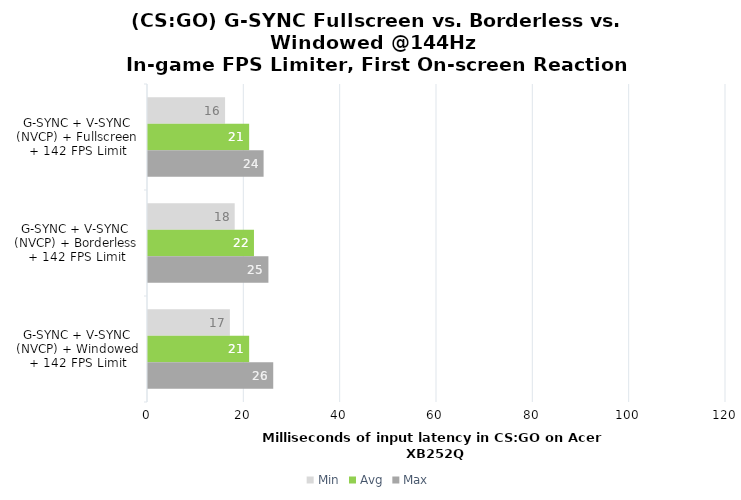
| Category | Min | Avg | Max |
|---|---|---|---|
| G-SYNC + V-SYNC (NVCP) + Fullscreen + 142 FPS Limit | 16 | 21 | 24 |
| G-SYNC + V-SYNC (NVCP) + Borderless + 142 FPS Limit | 18 | 22 | 25 |
| G-SYNC + V-SYNC (NVCP) + Windowed + 142 FPS Limit | 17 | 21 | 26 |